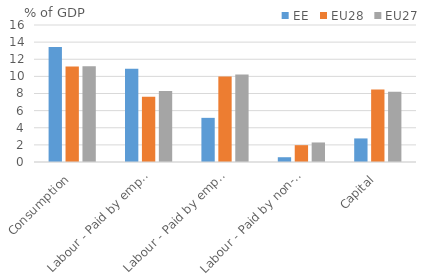
| Category | EE | EU28 | EU27 |
|---|---|---|---|
| Consumption | 13.417 | 11.162 | 11.186 |
| Labour - Paid by employers | 10.887 | 7.618 | 8.281 |
| Labour - Paid by employees | 5.156 | 9.997 | 10.231 |
| Labour - Paid by non-employed | 0.558 | 1.966 | 2.281 |
| Capital | 2.752 | 8.473 | 8.218 |